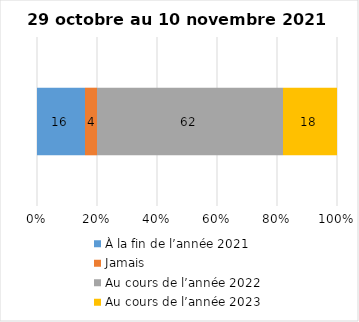
| Category | À la fin de l’année 2021 | Jamais | Au cours de l’année 2022 | Au cours de l’année 2023 |
|---|---|---|---|---|
| 0 | 16 | 4 | 62 | 18 |